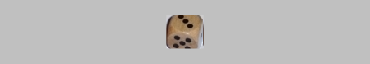
| Category | 1 | 2 | 3 | 4 | 5 | 6 |
|---|---|---|---|---|---|---|
|  | 0 | 0 | 0 | 0 | 0 | 0 |
|  | 0 | 0 | 0 | 0 | 0 | 0 |
|  | 0 | 0 | 0 | 0 | 0 | 0 |
| 3 | 0 | 0 | 1 | 0 | 0 | 0 |